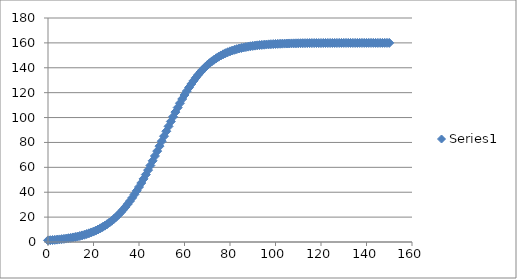
| Category | Series 0 |
|---|---|
| 0.0 | 1.3 |
| 1.0 | 1.429 |
| 2.0 | 1.571 |
| 3.0 | 1.726 |
| 4.0 | 1.897 |
| 5.0 | 2.084 |
| 6.0 | 2.29 |
| 7.0 | 2.516 |
| 8.0 | 2.763 |
| 9.0 | 3.035 |
| 10.0 | 3.333 |
| 11.0 | 3.659 |
| 12.0 | 4.016 |
| 13.0 | 4.408 |
| 14.0 | 4.837 |
| 15.0 | 5.306 |
| 16.0 | 5.819 |
| 17.0 | 6.379 |
| 18.0 | 6.992 |
| 19.0 | 7.66 |
| 20.0 | 8.39 |
| 21.0 | 9.185 |
| 22.0 | 10.051 |
| 23.0 | 10.993 |
| 24.0 | 12.016 |
| 25.0 | 13.128 |
| 26.0 | 14.333 |
| 27.0 | 15.638 |
| 28.0 | 17.049 |
| 29.0 | 18.572 |
| 30.0 | 20.213 |
| 31.0 | 21.979 |
| 32.0 | 23.875 |
| 33.0 | 25.907 |
| 34.0 | 28.078 |
| 35.0 | 30.393 |
| 36.0 | 32.855 |
| 37.0 | 35.466 |
| 38.0 | 38.226 |
| 39.0 | 41.135 |
| 40.0 | 44.191 |
| 41.0 | 47.39 |
| 42.0 | 50.725 |
| 43.0 | 54.19 |
| 44.0 | 57.773 |
| 45.0 | 61.464 |
| 46.0 | 65.25 |
| 47.0 | 69.114 |
| 48.0 | 73.04 |
| 49.0 | 77.009 |
| 50.0 | 81.004 |
| 51.0 | 85.003 |
| 52.0 | 88.988 |
| 53.0 | 92.937 |
| 54.0 | 96.832 |
| 55.0 | 100.655 |
| 56.0 | 104.389 |
| 57.0 | 108.017 |
| 58.0 | 111.526 |
| 59.0 | 114.905 |
| 60.0 | 118.144 |
| 61.0 | 121.234 |
| 62.0 | 124.172 |
| 63.0 | 126.952 |
| 64.0 | 129.574 |
| 65.0 | 132.038 |
| 66.0 | 134.346 |
| 67.0 | 136.5 |
| 68.0 | 138.505 |
| 69.0 | 140.366 |
| 70.0 | 142.088 |
| 71.0 | 143.679 |
| 72.0 | 145.144 |
| 73.0 | 146.492 |
| 74.0 | 147.729 |
| 75.0 | 148.862 |
| 76.0 | 149.898 |
| 77.0 | 150.844 |
| 78.0 | 151.708 |
| 79.0 | 152.494 |
| 80.0 | 153.209 |
| 81.0 | 153.86 |
| 82.0 | 154.45 |
| 83.0 | 154.986 |
| 84.0 | 155.471 |
| 85.0 | 155.912 |
| 86.0 | 156.31 |
| 87.0 | 156.67 |
| 88.0 | 156.996 |
| 89.0 | 157.291 |
| 90.0 | 157.557 |
| 91.0 | 157.798 |
| 92.0 | 158.015 |
| 93.0 | 158.211 |
| 94.0 | 158.388 |
| 95.0 | 158.548 |
| 96.0 | 158.692 |
| 97.0 | 158.821 |
| 98.0 | 158.938 |
| 99.0 | 159.044 |
| 100.0 | 159.139 |
| 101.0 | 159.224 |
| 102.0 | 159.302 |
| 103.0 | 159.371 |
| 104.0 | 159.434 |
| 105.0 | 159.49 |
| 106.0 | 159.541 |
| 107.0 | 159.587 |
| 108.0 | 159.628 |
| 109.0 | 159.665 |
| 110.0 | 159.699 |
| 111.0 | 159.729 |
| 112.0 | 159.756 |
| 113.0 | 159.78 |
| 114.0 | 159.802 |
| 115.0 | 159.822 |
| 116.0 | 159.84 |
| 117.0 | 159.856 |
| 118.0 | 159.87 |
| 119.0 | 159.883 |
| 120.0 | 159.895 |
| 121.0 | 159.905 |
| 122.0 | 159.915 |
| 123.0 | 159.923 |
| 124.0 | 159.931 |
| 125.0 | 159.938 |
| 126.0 | 159.944 |
| 127.0 | 159.95 |
| 128.0 | 159.955 |
| 129.0 | 159.959 |
| 130.0 | 159.963 |
| 131.0 | 159.967 |
| 132.0 | 159.97 |
| 133.0 | 159.973 |
| 134.0 | 159.976 |
| 135.0 | 159.978 |
| 136.0 | 159.98 |
| 137.0 | 159.982 |
| 138.0 | 159.984 |
| 139.0 | 159.986 |
| 140.0 | 159.987 |
| 141.0 | 159.988 |
| 142.0 | 159.99 |
| 143.0 | 159.991 |
| 144.0 | 159.992 |
| 145.0 | 159.992 |
| 146.0 | 159.993 |
| 147.0 | 159.994 |
| 148.0 | 159.994 |
| 149.0 | 159.995 |
| 150.0 | 159.996 |